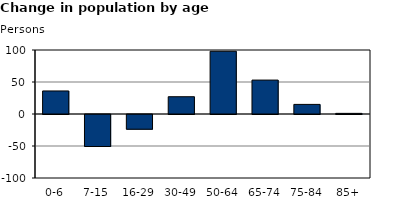
| Category | Series 2 |
|---|---|
| 0-6 | 36 |
| 7-15 | -50 |
| 16-29 | -23 |
| 30-49 | 27 |
| 50-64 | 98 |
| 65-74 | 53 |
| 75-84 | 15 |
| 85+ | 1 |